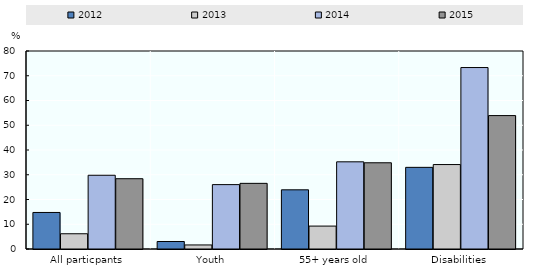
| Category | 2012 | 2013 | 2014 | 2015 |
|---|---|---|---|---|
| All particpants | 14.761 | 6.157 | 29.795 | 28.402 |
| Youth | 3.03 | 1.639 | 26.016 | 26.526 |
| 55+ years old | 23.913 | 9.259 | 35.223 | 34.839 |
| Disabilities | 32.992 | 34.118 | 73.32 | 53.906 |